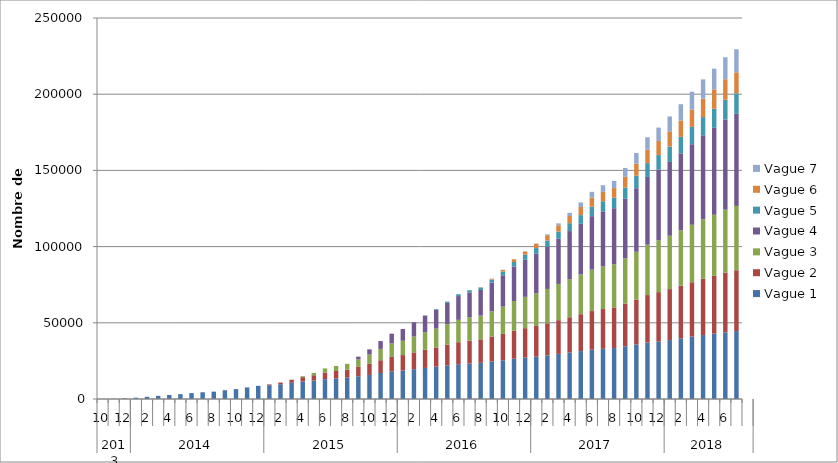
| Category | Vague 1 | Vague 2 | Vague 3 | Vague 4 | Vague 5 | Vague 6 | Vague 7 |
|---|---|---|---|---|---|---|---|
| 0 | 29 | 0 | 0 | 0 | 0 | 0 | 0 |
| 1 | 136 | 0 | 0 | 0 | 0 | 0 | 0 |
| 2 | 402 | 0 | 0 | 0 | 0 | 0 | 0 |
| 3 | 860 | 0 | 0 | 0 | 0 | 0 | 0 |
| 4 | 1448 | 0 | 0 | 0 | 0 | 0 | 0 |
| 5 | 2060 | 0 | 0 | 0 | 0 | 0 | 0 |
| 6 | 2633 | 0 | 0 | 0 | 0 | 0 | 0 |
| 7 | 3194 | 0 | 0 | 0 | 0 | 0 | 0 |
| 8 | 3875 | 0 | 0 | 0 | 0 | 0 | 0 |
| 9 | 4409 | 0 | 0 | 0 | 0 | 0 | 0 |
| 10 | 4832 | 0 | 0 | 0 | 0 | 0 | 0 |
| 11 | 5744 | 0 | 0 | 0 | 0 | 0 | 0 |
| 12 | 6483 | 0 | 0 | 0 | 0 | 0 | 0 |
| 13 | 7599 | 0 | 0 | 0 | 0 | 0 | 0 |
| 14 | 8641 | 2 | 0 | 0 | 0 | 0 | 0 |
| 15 | 9067 | 504 | 0 | 0 | 0 | 0 | 0 |
| 16 | 9688 | 1116 | 0 | 0 | 0 | 2 | 0 |
| 17 | 10595 | 2041 | 0 | 0 | 0 | 2 | 0 |
| 18 | 11479 | 2864 | 592 | 0 | 0 | 3 | 0 |
| 19 | 12099 | 3497 | 1524 | 0 | 0 | 4 | 0 |
| 20 | 13000 | 4371 | 2693 | 1 | 0 | 5 | 0 |
| 21 | 13477 | 4911 | 3320 | 1 | 0 | 6 | 0 |
| 22 | 14004 | 5287 | 3733 | 23 | 0 | 6 | 0 |
| 23 | 14878 | 6241 | 4865 | 1794 | 0 | 6 | 0 |
| 24 | 15787 | 7267 | 6099 | 3420 | 0 | 6 | 0 |
| 25 | 17050 | 8395 | 7442 | 5123 | 0 | 6 | 0 |
| 26 | 18144 | 9469 | 8843 | 6404 | 0 | 6 | 0 |
| 27 | 18637 | 10183 | 9383 | 7706 | 14 | 6 | 0 |
| 28 | 19551 | 11026 | 10441 | 9314 | 14 | 6 | 0 |
| 29 | 20383 | 11908 | 11538 | 10905 | 95 | 6 | 0 |
| 30 | 21206 | 12618 | 12377 | 12410 | 410 | 24 | 0 |
| 31 | 22034 | 13571 | 13460 | 14030 | 841 | 24 | 0 |
| 32 | 22845 | 14427 | 14688 | 15588 | 1198 | 41 | 0 |
| 33 | 23278 | 14993 | 15254 | 16426 | 1426 | 58 | 0 |
| 34 | 23729 | 15386 | 15583 | 16846 | 1628 | 140 | 0 |
| 35 | 24572 | 16273 | 16703 | 18823 | 1988 | 586 | 10 |
| 36 | 25410 | 17282 | 17974 | 20482 | 2409 | 1180 | 21 |
| 37 | 26448 | 18306 | 19519 | 22625 | 2993 | 1820 | 31 |
| 38 | 27169 | 19313 | 20568 | 24324 | 3279 | 2139 | 41 |
| 39 | 27774 | 20179 | 21370 | 26002 | 3712 | 2878 | 159 |
| 40 | 28628 | 21067 | 22517 | 27622 | 4143 | 3541 | 520 |
| 41 | 29605 | 22113 | 23793 | 29673 | 4659 | 4174 | 1234 |
| 42 | 30498 | 23158 | 24979 | 31550 | 5171 | 4734 | 2060 |
| 43 | 31438 | 24229 | 26085 | 33221 | 5685 | 5330 | 2984 |
| 44 | 32359 | 25330 | 27191 | 35080 | 6211 | 5933 | 3825 |
| 45 | 32944 | 26079 | 27926 | 36187 | 6600 | 6150 | 4365 |
| 46 | 33426 | 26643 | 28292 | 36828 | 6869 | 6339 | 4701 |
| 47 | 34579 | 27950 | 29714 | 39100 | 7418 | 7064 | 5769 |
| 48 | 35787 | 29502 | 31289 | 41738 | 8169 | 7926 | 7007 |
| 49 | 37064 | 31129 | 33048 | 44471 | 9074 | 8737 | 8207 |
| 50 | 37804 | 32314 | 34017 | 46397 | 9513 | 9254 | 8790 |
| 51 | 38655 | 33474 | 35006 | 48397 | 10113 | 9996 | 9765 |
| 52 | 39829 | 34517 | 36296 | 50575 | 10791 | 10773 | 10655 |
| 53 | 40946 | 35655 | 37730 | 52839 | 11369 | 11418 | 11686 |
| 54 | 41948 | 36936 | 39045 | 55088 | 11959 | 12102 | 12646 |
| 55 | 42904 | 37930 | 40056 | 57067 | 12473 | 12733 | 13569 |
| 56 | 43750 | 39139 | 41356 | 59110 | 13031 | 13413 | 14432 |
| 57 | 44561 | 39917 | 42223 | 60397 | 13453 | 13819 | 15093 |